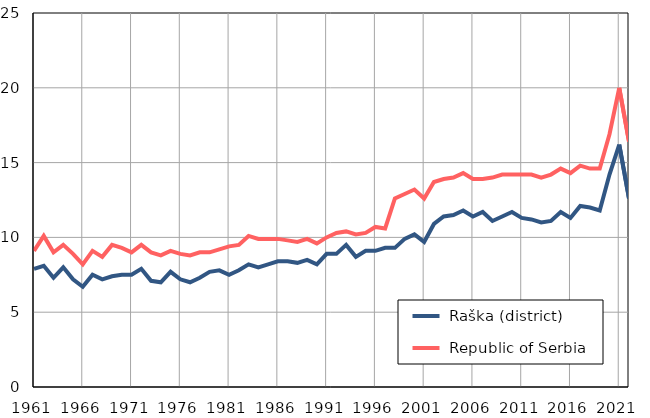
| Category |  Raška (district) |  Republic of Serbia |
|---|---|---|
| 1961.0 | 7.9 | 9.1 |
| 1962.0 | 8.1 | 10.1 |
| 1963.0 | 7.3 | 9 |
| 1964.0 | 8 | 9.5 |
| 1965.0 | 7.2 | 8.9 |
| 1966.0 | 6.7 | 8.2 |
| 1967.0 | 7.5 | 9.1 |
| 1968.0 | 7.2 | 8.7 |
| 1969.0 | 7.4 | 9.5 |
| 1970.0 | 7.5 | 9.3 |
| 1971.0 | 7.5 | 9 |
| 1972.0 | 7.9 | 9.5 |
| 1973.0 | 7.1 | 9 |
| 1974.0 | 7 | 8.8 |
| 1975.0 | 7.7 | 9.1 |
| 1976.0 | 7.2 | 8.9 |
| 1977.0 | 7 | 8.8 |
| 1978.0 | 7.3 | 9 |
| 1979.0 | 7.7 | 9 |
| 1980.0 | 7.8 | 9.2 |
| 1981.0 | 7.5 | 9.4 |
| 1982.0 | 7.8 | 9.5 |
| 1983.0 | 8.2 | 10.1 |
| 1984.0 | 8 | 9.9 |
| 1985.0 | 8.2 | 9.9 |
| 1986.0 | 8.4 | 9.9 |
| 1987.0 | 8.4 | 9.8 |
| 1988.0 | 8.3 | 9.7 |
| 1989.0 | 8.5 | 9.9 |
| 1990.0 | 8.2 | 9.6 |
| 1991.0 | 8.9 | 10 |
| 1992.0 | 8.9 | 10.3 |
| 1993.0 | 9.5 | 10.4 |
| 1994.0 | 8.7 | 10.2 |
| 1995.0 | 9.1 | 10.3 |
| 1996.0 | 9.1 | 10.7 |
| 1997.0 | 9.3 | 10.6 |
| 1998.0 | 9.3 | 12.6 |
| 1999.0 | 9.9 | 12.9 |
| 2000.0 | 10.2 | 13.2 |
| 2001.0 | 9.7 | 12.6 |
| 2002.0 | 10.9 | 13.7 |
| 2003.0 | 11.4 | 13.9 |
| 2004.0 | 11.5 | 14 |
| 2005.0 | 11.8 | 14.3 |
| 2006.0 | 11.4 | 13.9 |
| 2007.0 | 11.7 | 13.9 |
| 2008.0 | 11.1 | 14 |
| 2009.0 | 11.4 | 14.2 |
| 2010.0 | 11.7 | 14.2 |
| 2011.0 | 11.3 | 14.2 |
| 2012.0 | 11.2 | 14.2 |
| 2013.0 | 11 | 14 |
| 2014.0 | 11.1 | 14.2 |
| 2015.0 | 11.7 | 14.6 |
| 2016.0 | 11.3 | 14.3 |
| 2017.0 | 12.1 | 14.8 |
| 2018.0 | 12 | 14.6 |
| 2019.0 | 11.8 | 14.6 |
| 2020.0 | 14.2 | 16.9 |
| 2021.0 | 16.2 | 20 |
| 2022.0 | 12.6 | 16.4 |